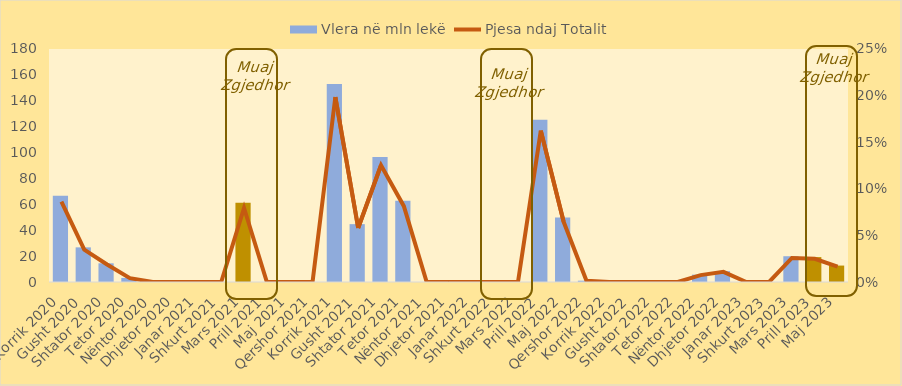
| Category | Vlera në mln lekë |
|---|---|
| Korrik 2020 | 66.54 |
| Gusht 2020 | 26.76 |
| Shtator 2020 | 14.44 |
| Tetor 2020 | 3.16 |
| Nëntor 2020 | 0 |
| Dhjetor 2020 | 0 |
| Janar 2021 | 0 |
| Shkurt 2021 | 0 |
| Mars 2021 | 61.27 |
| Prill 2021 | 0 |
| Maj 2021 | 0 |
| Qershor 2021 | 0 |
| Korrik 2021 | 153 |
| Gusht 2021 | 44.7 |
| Shtator 2021 | 96.55 |
| Tetor 2021 | 62.75 |
| Nëntor 2021 | 0 |
| Dhjetor 2021 | 0 |
| Janar 2022 | 0 |
| Shkurt 2022 | 0 |
| Mars 2022 | 0 |
| Prill 2022 | 125.25 |
| Maj 2022 | 49.8 |
| Qershor 2022 | 1 |
| Korrik 2022 | 0 |
| Gusht 2022 | 0 |
| Shtator 2022 | 0 |
| Tetor 2022 | 0 |
| Nëntor 2022 | 5.678 |
| Dhjetor 2022 | 8.362 |
| Janar 2023 | 0 |
| Shkurt 2023 | 0 |
| Mars 2023 | 19.91 |
| Prill 2023 | 19.23 |
| Maj 2023 | 12.697 |